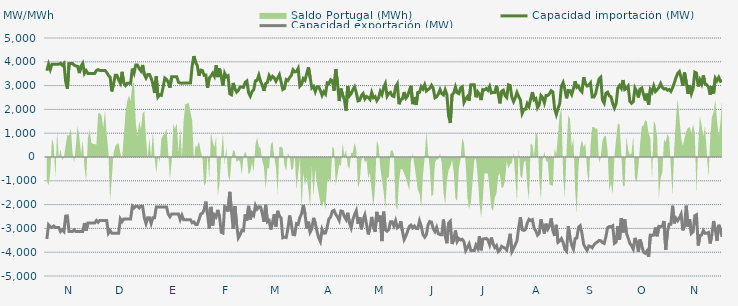
| Category | Capacidad importación (MW) | Capacidad exportación (MW) |
|---|---|---|
| 0 | 3625 | -3445.833 |
| 1900-01-01 | 3900 | -2849.25 |
| 1900-01-02 | 3675 | -2929.167 |
| 1900-01-03 | 3900 | -2966.667 |
| 1900-01-04 | 3900 | -2900 |
| 1900-01-05 | 3900 | -2966.667 |
| 1900-01-06 | 3900 | -2966.667 |
| 1900-01-07 | 3900 | -2966.667 |
| 1900-01-08 | 3933.333 | -3133.333 |
| 1900-01-09 | 3858.333 | -3058.333 |
| 1900-01-10 | 3933.333 | -3133.333 |
| 1900-01-11 | 3175 | -2483.333 |
| 1900-01-12 | 2862.5 | -2475 |
| 1900-01-13 | 3933.333 | -3133.333 |
| 1900-01-14 | 3933.333 | -3133.333 |
| 1900-01-15 | 3933.333 | -3133.333 |
| 1900-01-16 | 3858.333 | -3058.333 |
| 1900-01-17 | 3825 | -3133.333 |
| 1900-01-18 | 3808.333 | -3133.333 |
| 1900-01-19 | 3525 | -3133.333 |
| 1900-01-20 | 3816.708 | -3133.333 |
| 1900-01-21 | 3933.333 | -3133.333 |
| 1900-01-22 | 3512.5 | -2775 |
| 1900-01-23 | 3627.083 | -3095.833 |
| 1900-01-24 | 3512.5 | -2775 |
| 1900-01-25 | 3512.5 | -2775 |
| 1900-01-26 | 3512.5 | -2775 |
| 1900-01-27 | 3512.5 | -2775 |
| 1900-01-28 | 3512.5 | -2775 |
| 1900-01-29 | 3633.333 | -2666.667 |
| 1900-01-30 | 3670.833 | -2741.667 |
| 1900-01-31 | 3633.333 | -2666.667 |
| 1900-02-01 | 3633.333 | -2666.667 |
| 1900-02-02 | 3633.333 | -2666.667 |
| 1900-02-03 | 3633.333 | -2666.667 |
| 1900-02-04 | 3557.083 | -2666.667 |
| 1900-02-05 | 3433.333 | -3200 |
| 1900-02-06 | 3358.333 | -3087.5 |
| 1900-02-07 | 2756.25 | -3200 |
| 1900-02-08 | 3066.667 | -3200 |
| 1900-02-09 | 3433.333 | -3200 |
| 1900-02-10 | 3433.333 | -3200 |
| 1900-02-11 | 3232.417 | -3200 |
| 1900-02-12 | 3100 | -2600 |
| 1900-02-13 | 3579.167 | -2712.5 |
| 1900-02-14 | 3100 | -2600 |
| 1900-02-15 | 3000.75 | -2600 |
| 1900-02-16 | 3100 | -2600 |
| 1900-02-17 | 3100 | -2600 |
| 1900-02-18 | 3100 | -2600 |
| 1900-02-19 | 3712.917 | -2066.667 |
| 1900-02-20 | 3527.083 | -2141.667 |
| 1900-02-21 | 3866.667 | -2066.667 |
| 1900-02-22 | 3866.667 | -2066.667 |
| 1900-02-23 | 3716.667 | -2141.667 |
| 1900-02-24 | 3616.667 | -2066.667 |
| 1900-02-25 | 3866.667 | -2066.667 |
| 1900-02-26 | 3466.667 | -2550 |
| 1900-02-27 | 3316.667 | -2795.833 |
| 1900-02-28 | 3466.667 | -2550 |
| 1900-02-28 | 3466.667 | -2550 |
| 1900-03-01 | 3316.667 | -2795.833 |
| 1900-03-02 | 3082.167 | -2550 |
| 1900-03-03 | 2687.5 | -2550 |
| 1900-03-04 | 3400 | -2100 |
| 1900-03-05 | 2520.833 | -2100 |
| 1900-03-06 | 2614.583 | -2100 |
| 1900-03-07 | 2591.25 | -2100 |
| 1900-03-08 | 2932.083 | -2100 |
| 1900-03-09 | 3318.75 | -2100 |
| 1900-03-10 | 3262.5 | -2100 |
| 1900-03-11 | 3139.583 | -2400 |
| 1900-03-12 | 2912.5 | -2512.5 |
| 1900-03-13 | 3366.667 | -2400 |
| 1900-03-14 | 3366.667 | -2400 |
| 1900-03-15 | 3366.667 | -2400 |
| 1900-03-16 | 3366.667 | -2400 |
| 1900-03-17 | 3139.583 | -2400 |
| 1900-03-18 | 3108.333 | -2633.333 |
| 1900-03-19 | 3100 | -2445.833 |
| 1900-03-20 | 3108.333 | -2633.333 |
| 1900-03-21 | 3108.333 | -2633.333 |
| 1900-03-22 | 3108.333 | -2633.333 |
| 1900-03-23 | 3108.333 | -2633.333 |
| 1900-03-24 | 3108.333 | -2633.333 |
| 1900-03-25 | 3822.917 | -2766.667 |
| 1900-03-26 | 4239.583 | -2729.167 |
| 1900-03-27 | 3979.167 | -2833.333 |
| 1900-03-28 | 3841.667 | -2833.333 |
| 1900-03-29 | 3414.375 | -2634.375 |
| 1900-03-30 | 3652.5 | -2392.5 |
| 1900-03-31 | 3633.75 | -2364.375 |
| 1900-04-01 | 3431.25 | -2212.5 |
| 1900-04-02 | 3442.5 | -1876.875 |
| 1900-04-03 | 2908.125 | -2420.625 |
| 1900-04-04 | 3318.75 | -3009.375 |
| 1900-04-05 | 3401.25 | -2096.25 |
| 1900-04-06 | 3519.375 | -2876.25 |
| 1900-04-07 | 3392.5 | -2430 |
| 1900-04-08 | 3856.875 | -2512.5 |
| 1900-04-09 | 3356.25 | -2221.875 |
| 1900-04-10 | 3727.5 | -2516.25 |
| 1900-04-11 | 3372.5 | -3157.5 |
| 1900-04-12 | 3000.208 | -3195 |
| 1900-04-13 | 3522.083 | -2079.375 |
| 1900-04-14 | 3371.667 | -2122.5 |
| 1900-04-15 | 3412.5 | -2291.25 |
| 1900-04-16 | 2653.125 | -1464.375 |
| 1900-04-17 | 2615 | -2298.75 |
| 1900-04-18 | 3110.625 | -3018.75 |
| 1900-04-19 | 2861.792 | -2062.5 |
| 1900-04-20 | 2726.042 | -2823.75 |
| 1900-04-21 | 2799.583 | -3397.5 |
| 1900-04-22 | 2936.25 | -3273.75 |
| 1900-04-23 | 2938.125 | -3091.875 |
| 1900-04-24 | 2925 | -3101.25 |
| 1900-04-25 | 3136.875 | -2413.125 |
| 1900-04-26 | 3195.208 | -2666.25 |
| 1900-04-27 | 2702.083 | -2053.125 |
| 1900-04-28 | 2556.042 | -2621.25 |
| 1900-04-29 | 2748.75 | -2355 |
| 1900-04-30 | 2825.625 | -2448.75 |
| 1900-05-01 | 3204.375 | -2034.375 |
| 1900-05-02 | 3223.333 | -2188.125 |
| 1900-05-03 | 3440.625 | -2092.5 |
| 1900-05-04 | 3180 | -2100 |
| 1900-05-05 | 3016.875 | -2368.125 |
| 1900-05-06 | 2777.292 | -2722.5 |
| 1900-05-07 | 3084.375 | -2008.125 |
| 1900-05-08 | 3130.833 | -2720.625 |
| 1900-05-09 | 3418.75 | -2671.875 |
| 1900-05-10 | 3277.917 | -3046.875 |
| 1900-05-11 | 3390.833 | -2735.625 |
| 1900-05-12 | 3326.25 | -2407.5 |
| 1900-05-13 | 3180 | -2921.25 |
| 1900-05-14 | 3320.625 | -2262.708 |
| 1900-05-15 | 3457.5 | -2488.125 |
| 1900-05-16 | 3158.75 | -2557.5 |
| 1900-05-17 | 2836.25 | -3393.75 |
| 1900-05-18 | 2879.167 | -3365.625 |
| 1900-05-19 | 3254.167 | -3384.375 |
| 1900-05-20 | 3214.167 | -3018.75 |
| 1900-05-21 | 3335.625 | -2460 |
| 1900-05-22 | 3429.375 | -2818.125 |
| 1900-05-23 | 3663.75 | -3258.75 |
| 1900-05-24 | 3577.583 | -3268.125 |
| 1900-05-25 | 3586.875 | -2801.25 |
| 1900-05-26 | 3721.875 | -2831.25 |
| 1900-05-27 | 2977.5 | -2542.5 |
| 1900-05-28 | 3058.043 | -2379.13 |
| 1900-05-29 | 3294.375 | -2013.75 |
| 1900-05-30 | 3223.125 | -2388.75 |
| 1900-05-31 | 3506.25 | -3005.625 |
| 1900-06-01 | 3770.625 | -2718.75 |
| 1900-06-02 | 3346.875 | -3153.75 |
| 1900-06-03 | 2898.75 | -3009.375 |
| 1900-06-04 | 2966.25 | -2556.708 |
| 1900-06-05 | 2745.417 | -2786.25 |
| 1900-06-06 | 2951.25 | -3112.083 |
| 1900-06-07 | 2955 | -3401.25 |
| 1900-06-08 | 2788.125 | -3553.125 |
| 1900-06-09 | 2587.5 | -3033.75 |
| 1900-06-10 | 2745 | -3200.625 |
| 1900-06-11 | 2645.625 | -3195 |
| 1900-06-12 | 3116.25 | -2932.5 |
| 1900-06-13 | 3084.375 | -2598.75 |
| 1900-06-14 | 3247.5 | -2520 |
| 1900-06-15 | 3208.125 | -2272.5 |
| 1900-06-16 | 2782.708 | -2238.75 |
| 1900-06-17 | 3697.5 | -2418.75 |
| 1900-06-18 | 3103.125 | -2514.375 |
| 1900-06-19 | 2351.667 | -2662.5 |
| 1900-06-20 | 2876.25 | -2268.75 |
| 1900-06-21 | 2613.75 | -2287.5 |
| 1900-06-22 | 2422.5 | -2499.375 |
| 1900-06-23 | 1945.5 | -2625 |
| 1900-06-24 | 2981.25 | -2341.875 |
| 1900-06-25 | 2567.917 | -2775 |
| 1900-06-26 | 2658.542 | -2977.5 |
| 1900-06-27 | 2829.375 | -2626.875 |
| 1900-06-28 | 2951.25 | -2420.625 |
| 1900-06-29 | 2701.875 | -2257.5 |
| 1900-06-30 | 2356.875 | -2804.792 |
| 1900-07-01 | 2381.875 | -2527.5 |
| 1900-07-02 | 2578.125 | -3035.625 |
| 1900-07-03 | 2666.25 | -2621.042 |
| 1900-07-04 | 2439.583 | -2431.875 |
| 1900-07-05 | 2546.667 | -2835 |
| 1900-07-06 | 2503.125 | -3253.125 |
| 1900-07-07 | 2418.75 | -2985 |
| 1900-07-08 | 2711.25 | -2516.25 |
| 1900-07-09 | 2490 | -2932.5 |
| 1900-07-10 | 2538.75 | -3144.375 |
| 1900-07-11 | 2367.708 | -2306.25 |
| 1900-07-12 | 2476.875 | -2730 |
| 1900-07-13 | 2754.375 | -2460 |
| 1900-07-14 | 2620.833 | -3533.333 |
| 1900-07-15 | 2916.875 | -2297.5 |
| 1900-07-16 | 3082.5 | -3063.75 |
| 1900-07-17 | 2553.75 | -3120 |
| 1900-07-18 | 2671.875 | -3043.125 |
| 1900-07-19 | 2716.875 | -2722.5 |
| 1900-07-20 | 2568.75 | -2724.375 |
| 1900-07-21 | 2540.625 | -2896.875 |
| 1900-07-22 | 2938.125 | -2677.5 |
| 1900-07-23 | 3066.667 | -2979.167 |
| 1900-07-24 | 2218.125 | -2926.875 |
| 1900-07-25 | 2411.25 | -2701.875 |
| 1900-07-26 | 2443.125 | -3125.625 |
| 1900-07-27 | 2729.167 | -3466.667 |
| 1900-07-28 | 2471.25 | -3315 |
| 1900-07-29 | 2561.875 | -3127.375 |
| 1900-07-30 | 2778.75 | -2917.5 |
| 1900-07-31 | 2992.5 | -2861.25 |
| 1900-08-01 | 2221.875 | -2981.25 |
| 1900-08-02 | 2505 | -2900.625 |
| 1900-08-03 | 2187.5 | -3000 |
| 1900-08-04 | 2711.75 | -3007.5 |
| 1900-08-05 | 2723.125 | -2684.417 |
| 1900-08-06 | 2956.125 | -2899.25 |
| 1900-08-07 | 2855.625 | -3256.875 |
| 1900-08-08 | 3033.333 | -3366.667 |
| 1900-08-09 | 2771.25 | -3262.5 |
| 1900-08-10 | 2832.375 | -2842.5 |
| 1900-08-11 | 2887.5 | -2711.042 |
| 1900-08-12 | 3015 | -2735.625 |
| 1900-08-13 | 2893.125 | -3015 |
| 1900-08-14 | 2486.25 | -3135 |
| 1900-08-15 | 2529.375 | -2958.75 |
| 1900-08-16 | 2643.75 | -3226.875 |
| 1900-08-17 | 2831.667 | -3261.75 |
| 1900-08-18 | 2662.25 | -3262.25 |
| 1900-08-19 | 2606.25 | -2627.792 |
| 1900-08-20 | 2823.75 | -3316.875 |
| 1900-08-21 | 2608.125 | -3622.5 |
| 1900-08-22 | 1721.458 | -2778.75 |
| 1900-08-23 | 1429.792 | -2700 |
| 1900-08-24 | 2611.875 | -3654.375 |
| 1900-08-25 | 2683.125 | -3478.125 |
| 1900-08-26 | 2941.875 | -3088.125 |
| 1900-08-27 | 2701.042 | -3549.167 |
| 1900-08-28 | 2664.375 | -3423.75 |
| 1900-08-29 | 2900.625 | -3487.5 |
| 1900-08-30 | 2951.25 | -3455.625 |
| 1900-08-31 | 2295 | -3562.5 |
| 1900-09-01 | 2445 | -3930 |
| 1900-09-02 | 2535 | -3798.75 |
| 1900-09-03 | 2364.375 | -3654.375 |
| 1900-09-04 | 3033.333 | -3933.333 |
| 1900-09-05 | 3033.333 | -3933.333 |
| 1900-09-06 | 3033.333 | -3933.333 |
| 1900-09-07 | 2508.75 | -3703.125 |
| 1900-09-08 | 2735.625 | -3838.125 |
| 1900-09-09 | 2628.75 | -3326.25 |
| 1900-09-10 | 2392.5 | -3918.75 |
| 1900-09-11 | 2835 | -3440.625 |
| 1900-09-12 | 2812.5 | -3438.75 |
| 1900-09-13 | 2880 | -3420 |
| 1900-09-14 | 2803.125 | -3481.875 |
| 1900-09-15 | 2964.375 | -3691.875 |
| 1900-09-16 | 2690.625 | -3386.25 |
| 1900-09-17 | 2715 | -3656.25 |
| 1900-09-18 | 2711.25 | -3804.375 |
| 1900-09-19 | 2998.125 | -3720 |
| 1900-09-20 | 2660.625 | -3978.75 |
| 1900-09-21 | 2253.75 | -3907.5 |
| 1900-09-22 | 2760 | -3751.875 |
| 1900-09-23 | 2808.75 | -3796.875 |
| 1900-09-24 | 2580 | -3828.75 |
| 1900-09-25 | 2499.375 | -3907.5 |
| 1900-09-26 | 3028.125 | -3577.5 |
| 1900-09-27 | 3001.875 | -3226.875 |
| 1900-09-28 | 2511.25 | -3976.875 |
| 1900-09-29 | 2326.875 | -3840 |
| 1900-09-30 | 2491.875 | -3684.375 |
| 1900-10-01 | 2710.208 | -3515.417 |
| 1900-10-02 | 2535 | -2956.875 |
| 1900-10-03 | 2401.875 | -2535 |
| 1900-10-04 | 1831.875 | -3056.25 |
| 1900-10-05 | 1995 | -3086.25 |
| 1900-10-06 | 2006.875 | -3037.5 |
| 1900-10-07 | 2244.375 | -2777.5 |
| 1900-10-08 | 2118.75 | -2619.375 |
| 1900-10-09 | 2437.5 | -2673.75 |
| 1900-10-10 | 2728.125 | -2634.375 |
| 1900-10-11 | 2403.75 | -2986.875 |
| 1900-10-12 | 2454.375 | -3099.375 |
| 1900-10-13 | 2071.875 | -3285 |
| 1900-10-14 | 2201.125 | -3208.125 |
| 1900-10-15 | 2582.958 | -2621.458 |
| 1900-10-16 | 2493.625 | -2943.125 |
| 1900-10-17 | 2270.5 | -3218.75 |
| 1900-10-18 | 2587.5 | -2803.125 |
| 1900-10-19 | 2581.875 | -3030 |
| 1900-10-20 | 2651.25 | -2895 |
| 1900-10-21 | 2784.375 | -2583.75 |
| 1900-10-22 | 2733.75 | -3084.375 |
| 1900-10-23 | 2030.625 | -3314.375 |
| 1900-10-24 | 1787.25 | -2849.375 |
| 1900-10-25 | 2040.625 | -3583.667 |
| 1900-10-26 | 2251.875 | -3525 |
| 1900-10-27 | 2977.5 | -3429.375 |
| 1900-10-28 | 3129.375 | -3594.583 |
| 1900-10-29 | 2844.375 | -3877.5 |
| 1900-10-30 | 2467.5 | -3956.25 |
| 1900-10-31 | 2793.75 | -2904.375 |
| 1900-11-01 | 2786.25 | -3382.5 |
| 1900-11-02 | 2626.875 | -3703.125 |
| 1900-11-03 | 2870.625 | -3871.875 |
| 1900-11-04 | 3183.75 | -3431.25 |
| 1900-11-05 | 2926.875 | -3403.125 |
| 1900-11-06 | 2979.375 | -2951.25 |
| 1900-11-07 | 2814.375 | -2887.5 |
| 1900-11-08 | 2737.5 | -3208.125 |
| 1900-11-09 | 3352.5 | -3671.25 |
| 1900-11-10 | 3078.75 | -3808.125 |
| 1900-11-11 | 2983.125 | -3926.25 |
| 1900-11-12 | 3018.75 | -3738.75 |
| 1900-11-13 | 3114.375 | -3751.875 |
| 1900-11-14 | 2520 | -3813.75 |
| 1900-11-15 | 2523.75 | -3697.292 |
| 1900-11-16 | 2658.542 | -3615 |
| 1900-11-17 | 2986.875 | -3575.625 |
| 1900-11-18 | 3273.625 | -3505.833 |
| 1900-11-19 | 3348.75 | -3519.375 |
| 1900-11-20 | 2390.625 | -3592.5 |
| 1900-11-21 | 2265 | -3631.875 |
| 1900-11-22 | 2675.625 | -3346.875 |
| 1900-11-23 | 2724.375 | -2973.75 |
| 1900-11-24 | 2571.875 | -2923.125 |
| 1900-11-25 | 2527.5 | -2930.042 |
| 1900-11-26 | 2244.375 | -2888.708 |
| 1900-11-27 | 2059.333 | -3626.25 |
| 1900-11-28 | 2244.375 | -3570 |
| 1900-11-29 | 2900 | -2900 |
| 1900-11-30 | 3007.5 | -3476.25 |
| 1900-12-01 | 2885.625 | -2562.917 |
| 1900-12-02 | 3233.333 | -3166.667 |
| 1900-12-03 | 2836.875 | -2610.208 |
| 1900-12-04 | 2889.375 | -3189.375 |
| 1900-12-05 | 2979.375 | -3399.375 |
| 1900-12-06 | 2345.625 | -3628.125 |
| 1900-12-07 | 2257.5 | -3725.625 |
| 1900-12-08 | 2323.125 | -3871.875 |
| 1900-12-09 | 2895 | -3401.25 |
| 1900-12-10 | 2760 | -3600 |
| 1900-12-11 | 2503.125 | -3987.75 |
| 1900-12-12 | 2855.625 | -3466.875 |
| 1900-12-13 | 2898.75 | -3720 |
| 1900-12-14 | 2628.75 | -3997.5 |
| 1900-12-15 | 2375.625 | -4044.375 |
| 1900-12-16 | 2660.625 | -3947.875 |
| 1900-12-17 | 2205 | -4190.625 |
| 1900-12-18 | 2840.625 | -3281.25 |
| 1900-12-19 | 2726.25 | -3292.5 |
| 1900-12-20 | 2983.125 | -3279.375 |
| 1900-12-21 | 2750.625 | -2960.625 |
| 1900-12-22 | 2827.5 | -3330 |
| 1900-12-23 | 2917.5 | -2915.625 |
| 1900-12-24 | 3087 | -2927.6 |
| 1900-12-25 | 2928.75 | -2903.792 |
| 1900-12-26 | 2857.5 | -2686.875 |
| 1900-12-27 | 2874.375 | -3894.375 |
| 1900-12-28 | 2803.125 | -3136.875 |
| 1900-12-29 | 2836.875 | -2825.625 |
| 1900-12-30 | 2752.5 | -2825.625 |
| 1900-12-31 | 2906.25 | -2049.375 |
| 1901-01-01 | 3106.875 | -2788.125 |
| 1901-01-02 | 3331.875 | -2572.5 |
| 1901-01-03 | 3513.75 | -2677.5 |
| 1901-01-04 | 3590.625 | -2555.625 |
| 1901-01-05 | 3328.125 | -2400 |
| 1901-01-06 | 2992.5 | -3084.375 |
| 1901-01-07 | 3551.25 | -2874.375 |
| 1901-01-08 | 3150 | -2045.625 |
| 1901-01-09 | 2658.75 | -2932.5 |
| 1901-01-10 | 3023.625 | -2619.5 |
| 1901-01-11 | 2664.375 | -3210 |
| 1901-01-12 | 2872.5 | -3142.5 |
| 1901-01-13 | 3564.375 | -2467.5 |
| 1901-01-14 | 3525 | -2430 |
| 1901-01-15 | 2966.25 | -3718.125 |
| 1901-01-16 | 3236.25 | -3300 |
| 1901-01-17 | 3069.375 | -3275.625 |
| 1901-01-18 | 3425.625 | -3086.25 |
| 1901-01-19 | 3071.25 | -3204.375 |
| 1901-01-20 | 3031.875 | -3206.25 |
| 1901-01-21 | 2947.5 | -3172.5 |
| 1901-01-22 | 2613.75 | -3633.75 |
| 1901-01-23 | 2977.5 | -3258.75 |
| 1901-01-24 | 2670 | -2689.583 |
| 1901-01-25 | 3315 | -3045 |
| 1901-01-26 | 3206.25 | -3523.125 |
| 1901-01-27 | 3348.75 | -2850 |
| 1901-01-28 | 3181.875 | -3038.125 |
| 1901-01-29 | 3225 | -3354.375 |